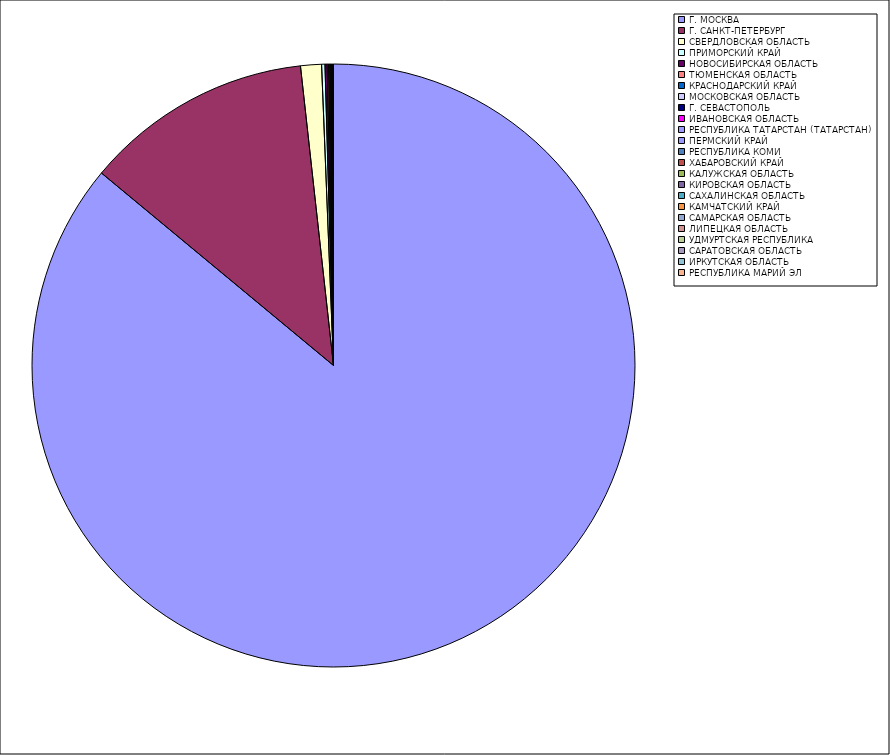
| Category | Оборот |
|---|---|
| Г. МОСКВА | 86.003 |
| Г. САНКТ-ПЕТЕРБУРГ | 12.228 |
| СВЕРДЛОВСКАЯ ОБЛАСТЬ | 1.119 |
| ПРИМОРСКИЙ КРАЙ | 0.18 |
| НОВОСИБИРСКАЯ ОБЛАСТЬ | 0.115 |
| ТЮМЕНСКАЯ ОБЛАСТЬ | 0.073 |
| КРАСНОДАРСКИЙ КРАЙ | 0.062 |
| МОСКОВСКАЯ ОБЛАСТЬ | 0.043 |
| Г. СЕВАСТОПОЛЬ | 0.025 |
| ИВАНОВСКАЯ ОБЛАСТЬ | 0.018 |
| РЕСПУБЛИКА ТАТАРСТАН (ТАТАРСТАН) | 0.015 |
| ПЕРМСКИЙ КРАЙ | 0.014 |
| РЕСПУБЛИКА КОМИ | 0.012 |
| ХАБАРОВСКИЙ КРАЙ | 0.012 |
| КАЛУЖСКАЯ ОБЛАСТЬ | 0.01 |
| КИРОВСКАЯ ОБЛАСТЬ | 0.009 |
| САХАЛИНСКАЯ ОБЛАСТЬ | 0.008 |
| КАМЧАТСКИЙ КРАЙ | 0.007 |
| САМАРСКАЯ ОБЛАСТЬ | 0.006 |
| ЛИПЕЦКАЯ ОБЛАСТЬ | 0.005 |
| УДМУРТСКАЯ РЕСПУБЛИКА | 0.005 |
| САРАТОВСКАЯ ОБЛАСТЬ | 0.004 |
| ИРКУТСКАЯ ОБЛАСТЬ | 0.004 |
| РЕСПУБЛИКА МАРИЙ ЭЛ | 0.003 |